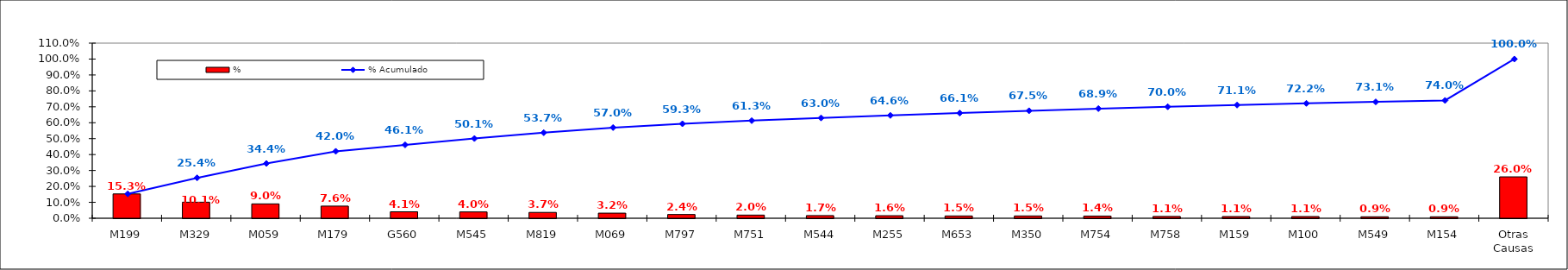
| Category | % |
|---|---|
| M199 | 0.153 |
| M329 | 0.101 |
| M059 | 0.09 |
| M179 | 0.076 |
| G560 | 0.041 |
| M545 | 0.04 |
| M819 | 0.037 |
| M069 | 0.032 |
| M797 | 0.024 |
| M751 | 0.02 |
| M544 | 0.017 |
| M255 | 0.016 |
| M653 | 0.015 |
| M350 | 0.015 |
| M754 | 0.014 |
| M758 | 0.011 |
| M159 | 0.011 |
| M100 | 0.011 |
| M549 | 0.009 |
| M154 | 0.009 |
| Otras Causas | 0.26 |